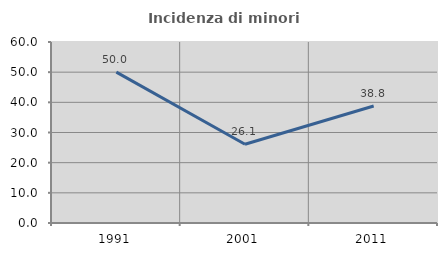
| Category | Incidenza di minori stranieri |
|---|---|
| 1991.0 | 50 |
| 2001.0 | 26.087 |
| 2011.0 | 38.793 |